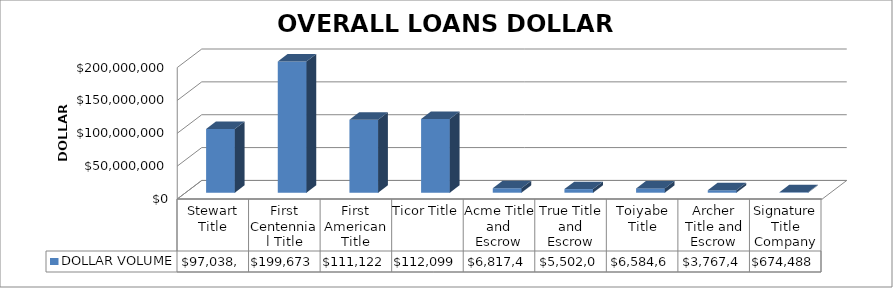
| Category | DOLLAR VOLUME |
|---|---|
| Stewart Title | 97038522 |
| First Centennial Title | 199673749 |
| First American Title | 111122443.91 |
| Ticor Title | 112099014 |
| Acme Title and Escrow | 6817400 |
| True Title and Escrow | 5502038 |
| Toiyabe Title | 6584678 |
| Archer Title and Escrow | 3767426 |
| Signature Title Company | 674488 |